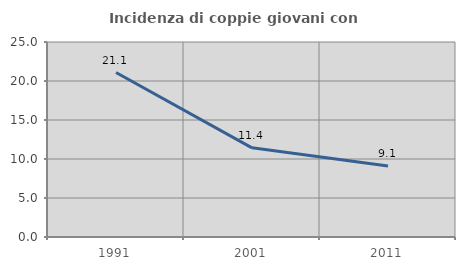
| Category | Incidenza di coppie giovani con figli |
|---|---|
| 1991.0 | 21.086 |
| 2001.0 | 11.429 |
| 2011.0 | 9.112 |